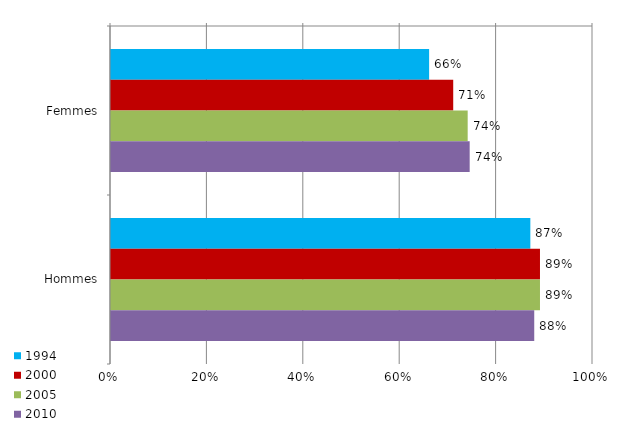
| Category | 1994 | 2000 | 2005 | 2010 |
|---|---|---|---|---|
| Femmes | 66 | 71 | 74 | 74.415 |
| Hommes | 87 | 89 | 89 | 87.809 |